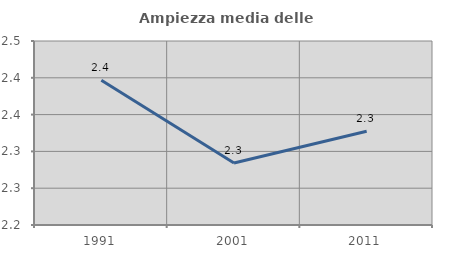
| Category | Ampiezza media delle famiglie |
|---|---|
| 1991.0 | 2.397 |
| 2001.0 | 2.284 |
| 2011.0 | 2.327 |